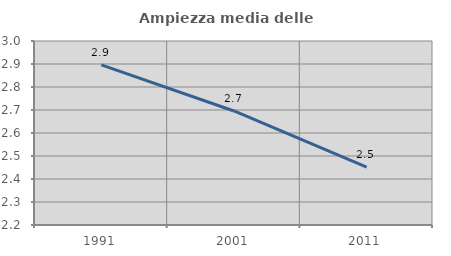
| Category | Ampiezza media delle famiglie |
|---|---|
| 1991.0 | 2.896 |
| 2001.0 | 2.696 |
| 2011.0 | 2.451 |